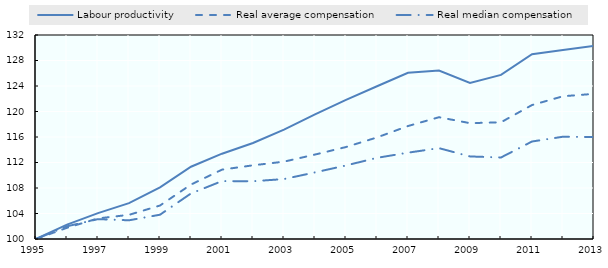
| Category | Labour productivity | Real average compensation | Real median compensation |
|---|---|---|---|
| 1995.0 | 100 | 100 | 100 |
| 1996.0 | 102.257 | 101.759 | 101.994 |
| 1997.0 | 104.056 | 103.228 | 103.116 |
| 1998.0 | 105.624 | 103.791 | 102.933 |
| 1999.0 | 108.106 | 105.252 | 103.81 |
| 2000.0 | 111.334 | 108.542 | 107.148 |
| 2001.0 | 113.381 | 110.881 | 109.084 |
| 2002.0 | 115.063 | 111.558 | 109.063 |
| 2003.0 | 117.166 | 112.134 | 109.4 |
| 2004.0 | 119.535 | 113.247 | 110.449 |
| 2005.0 | 121.835 | 114.428 | 111.537 |
| 2006.0 | 123.966 | 115.931 | 112.73 |
| 2007.0 | 126.065 | 117.721 | 113.542 |
| 2008.0 | 126.422 | 119.102 | 114.251 |
| 2009.0 | 124.489 | 118.169 | 112.951 |
| 2010.0 | 125.737 | 118.309 | 112.788 |
| 2011.0 | 128.98 | 121.013 | 115.292 |
| 2012.0 | 129.635 | 122.392 | 116.045 |
| 2013.0 | 130.286 | 122.768 | 115.983 |